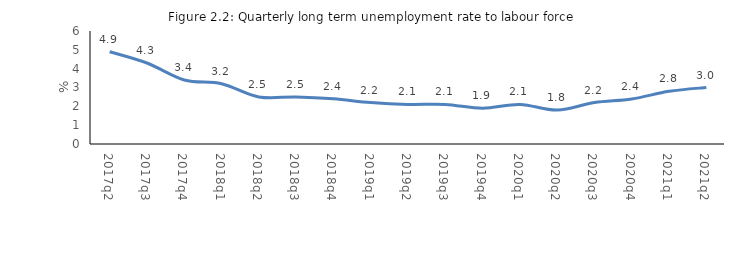
| Category | Series 0 |
|---|---|
| 2017q2 | 4.9 |
| 2017q3 | 4.3 |
| 2017q4 | 3.4 |
| 2018q1 | 3.2 |
| 2018q2 | 2.5 |
| 2018q3 | 2.5 |
| 2018q4 | 2.4 |
| 2019q1 | 2.2 |
| 2019q2 | 2.1 |
| 2019q3 | 2.1 |
| 2019q4 | 1.9 |
| 2020q1 | 2.1 |
| 2020q2 | 1.8 |
| 2020q3 | 2.2 |
| 2020q4 | 2.392 |
| 2021q1 | 2.8 |
| 2021q2 | 3 |